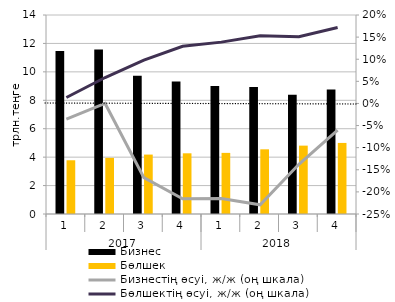
| Category | Бизнес | Бөлшек |
|---|---|---|
| 0 | 11.47 | 3.78 |
| 1 | 11.58 | 3.95 |
| 2 | 9.73 | 4.18 |
| 3 | 9.32 | 4.27 |
| 4 | 9.01 | 4.3 |
| 5 | 8.93 | 4.55 |
| 6 | 8.39 | 4.81 |
| 7 | 8.76 | 5 |